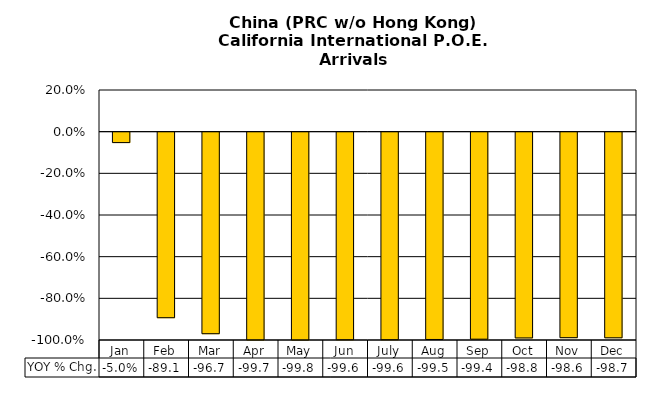
| Category | YOY % Chg. |
|---|---|
| Jan | -0.05 |
| Feb | -0.891 |
| Mar | -0.967 |
| Apr | -0.997 |
| May | -0.998 |
| Jun | -0.996 |
| July | -0.996 |
| Aug | -0.995 |
| Sep | -0.994 |
| Oct | -0.988 |
| Nov | -0.986 |
| Dec | -0.987 |